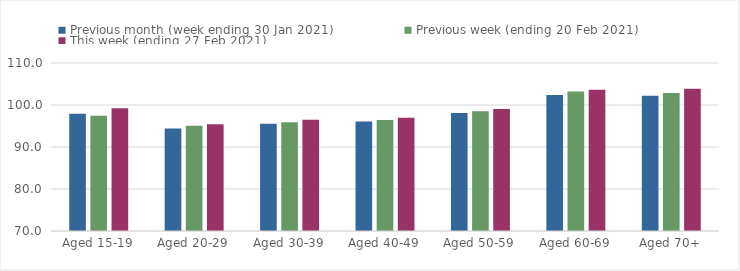
| Category | Previous month (week ending 30 Jan 2021) | Previous week (ending 20 Feb 2021) | This week (ending 27 Feb 2021) |
|---|---|---|---|
| Aged 15-19 | 97.93 | 97.44 | 99.24 |
| Aged 20-29 | 94.43 | 95.07 | 95.41 |
| Aged 30-39 | 95.54 | 95.92 | 96.48 |
| Aged 40-49 | 96.06 | 96.43 | 96.94 |
| Aged 50-59 | 98.07 | 98.53 | 99.02 |
| Aged 60-69 | 102.36 | 103.24 | 103.66 |
| Aged 70+ | 102.21 | 102.83 | 103.89 |